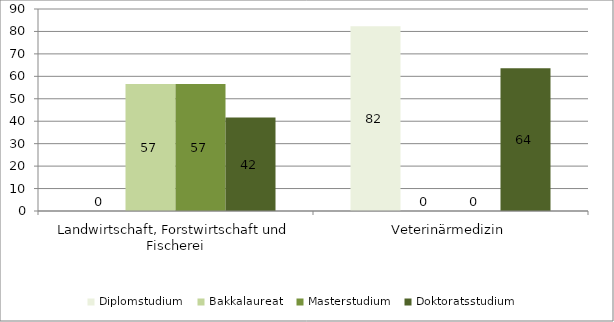
| Category | Diplomstudium  | Bakkalaureat  | Masterstudium  | Doktoratsstudium  |
|---|---|---|---|---|
| Landwirtschaft, Forstwirtschaft und Fischerei | 0 | 56.545 | 56.589 | 41.667 |
| Veterinärmedizin | 82.353 | 0 | 0 | 63.636 |